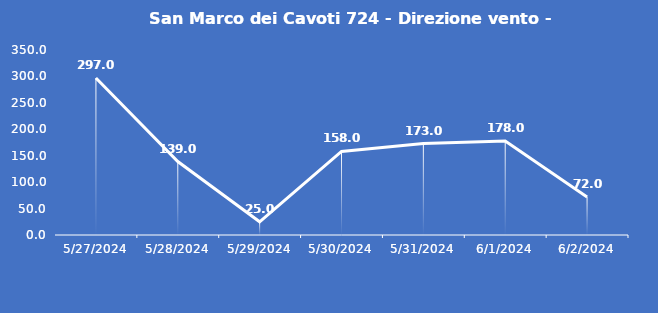
| Category | San Marco dei Cavoti 724 - Direzione vento - Grezzo (°N) |
|---|---|
| 5/27/24 | 297 |
| 5/28/24 | 139 |
| 5/29/24 | 25 |
| 5/30/24 | 158 |
| 5/31/24 | 173 |
| 6/1/24 | 178 |
| 6/2/24 | 72 |